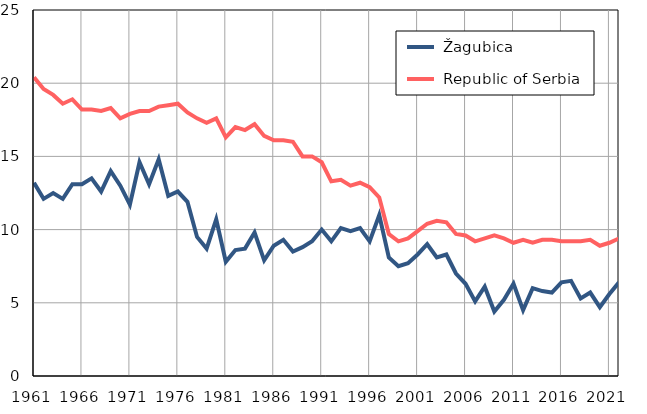
| Category |  Žagubica |  Republic of Serbia |
|---|---|---|
| 1961.0 | 13.2 | 20.4 |
| 1962.0 | 12.1 | 19.6 |
| 1963.0 | 12.5 | 19.2 |
| 1964.0 | 12.1 | 18.6 |
| 1965.0 | 13.1 | 18.9 |
| 1966.0 | 13.1 | 18.2 |
| 1967.0 | 13.5 | 18.2 |
| 1968.0 | 12.6 | 18.1 |
| 1969.0 | 14 | 18.3 |
| 1970.0 | 13 | 17.6 |
| 1971.0 | 11.7 | 17.9 |
| 1972.0 | 14.6 | 18.1 |
| 1973.0 | 13.1 | 18.1 |
| 1974.0 | 14.8 | 18.4 |
| 1975.0 | 12.3 | 18.5 |
| 1976.0 | 12.6 | 18.6 |
| 1977.0 | 11.9 | 18 |
| 1978.0 | 9.5 | 17.6 |
| 1979.0 | 8.7 | 17.3 |
| 1980.0 | 10.7 | 17.6 |
| 1981.0 | 7.8 | 16.3 |
| 1982.0 | 8.6 | 17 |
| 1983.0 | 8.7 | 16.8 |
| 1984.0 | 9.8 | 17.2 |
| 1985.0 | 7.9 | 16.4 |
| 1986.0 | 8.9 | 16.1 |
| 1987.0 | 9.3 | 16.1 |
| 1988.0 | 8.5 | 16 |
| 1989.0 | 8.8 | 15 |
| 1990.0 | 9.2 | 15 |
| 1991.0 | 10 | 14.6 |
| 1992.0 | 9.2 | 13.3 |
| 1993.0 | 10.1 | 13.4 |
| 1994.0 | 9.9 | 13 |
| 1995.0 | 10.1 | 13.2 |
| 1996.0 | 9.2 | 12.9 |
| 1997.0 | 11 | 12.2 |
| 1998.0 | 8.1 | 9.7 |
| 1999.0 | 7.5 | 9.2 |
| 2000.0 | 7.7 | 9.4 |
| 2001.0 | 8.3 | 9.9 |
| 2002.0 | 9 | 10.4 |
| 2003.0 | 8.1 | 10.6 |
| 2004.0 | 8.3 | 10.5 |
| 2005.0 | 7 | 9.7 |
| 2006.0 | 6.3 | 9.6 |
| 2007.0 | 5.1 | 9.2 |
| 2008.0 | 6.1 | 9.4 |
| 2009.0 | 4.4 | 9.6 |
| 2010.0 | 5.2 | 9.4 |
| 2011.0 | 6.3 | 9.1 |
| 2012.0 | 4.5 | 9.3 |
| 2013.0 | 6 | 9.1 |
| 2014.0 | 5.8 | 9.3 |
| 2015.0 | 5.7 | 9.3 |
| 2016.0 | 6.4 | 9.2 |
| 2017.0 | 6.5 | 9.2 |
| 2018.0 | 5.3 | 9.2 |
| 2019.0 | 5.7 | 9.3 |
| 2020.0 | 4.7 | 8.9 |
| 2021.0 | 5.6 | 9.1 |
| 2022.0 | 6.4 | 9.4 |